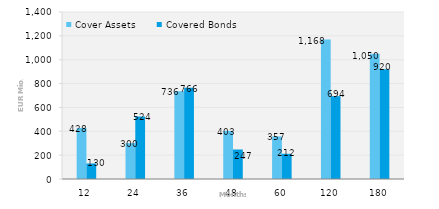
| Category | Cover Assets | Covered Bonds |
|---|---|---|
| 12.0 | 428.097 | 130.123 |
| 24.0 | 300.427 | 524 |
| 36.0 | 735.898 | 765.585 |
| 48.0 | 403.36 | 247.292 |
| 60.0 | 356.67 | 211.585 |
| 120.0 | 1168.473 | 694.324 |
| 180.0 | 1049.761 | 920.017 |